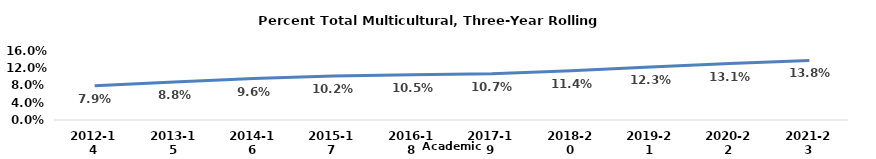
| Category | Series 0 |
|---|---|
| 2012-14 | 0.079 |
| 2013-15 | 0.088 |
| 2014-16 | 0.096 |
| 2015-17 | 0.102 |
| 2016-18 | 0.105 |
| 2017-19 | 0.107 |
| 2018-20 | 0.114 |
| 2019-21 | 0.123 |
| 2020-22 | 0.131 |
| 2021-23 | 0.138 |